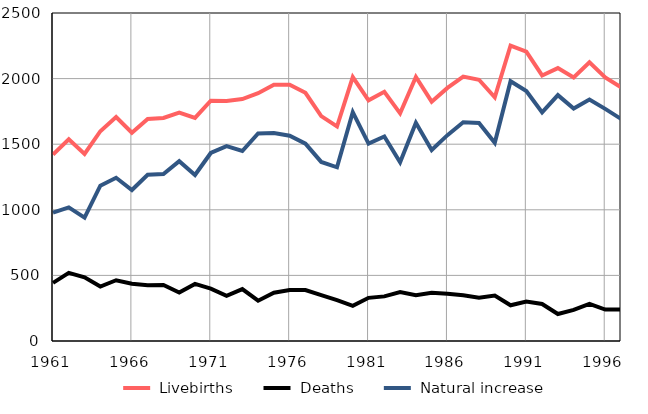
| Category |  Livebirths |  Deaths |  Natural increase |
|---|---|---|---|
| 1961.0 | 1421 | 443 | 978 |
| 1962.0 | 1537 | 519 | 1018 |
| 1963.0 | 1426 | 486 | 940 |
| 1964.0 | 1599 | 415 | 1184 |
| 1965.0 | 1707 | 463 | 1244 |
| 1966.0 | 1587 | 436 | 1151 |
| 1967.0 | 1692 | 425 | 1267 |
| 1968.0 | 1700 | 427 | 1273 |
| 1969.0 | 1741 | 370 | 1371 |
| 1970.0 | 1700 | 435 | 1265 |
| 1971.0 | 1832 | 399 | 1433 |
| 1972.0 | 1830 | 345 | 1485 |
| 1973.0 | 1844 | 396 | 1448 |
| 1974.0 | 1889 | 307 | 1582 |
| 1975.0 | 1954 | 368 | 1586 |
| 1976.0 | 1954 | 389 | 1565 |
| 1977.0 | 1892 | 388 | 1504 |
| 1978.0 | 1714 | 349 | 1365 |
| 1979.0 | 1635 | 311 | 1324 |
| 1980.0 | 2012 | 268 | 1744 |
| 1981.0 | 1834 | 329 | 1505 |
| 1982.0 | 1899 | 340 | 1559 |
| 1983.0 | 1735 | 373 | 1362 |
| 1984.0 | 2012 | 349 | 1663 |
| 1985.0 | 1824 | 368 | 1456 |
| 1986.0 | 1929 | 360 | 1569 |
| 1987.0 | 2015 | 348 | 1667 |
| 1988.0 | 1991 | 330 | 1661 |
| 1989.0 | 1857 | 346 | 1511 |
| 1990.0 | 2252 | 272 | 1980 |
| 1991.0 | 2206 | 301 | 1905 |
| 1992.0 | 2024 | 282 | 1742 |
| 1993.0 | 2080 | 206 | 1874 |
| 1994.0 | 2009 | 237 | 1772 |
| 1995.0 | 2124 | 283 | 1841 |
| 1996.0 | 2009 | 240 | 1769 |
| 1997.0 | 1934 | 241 | 1693 |